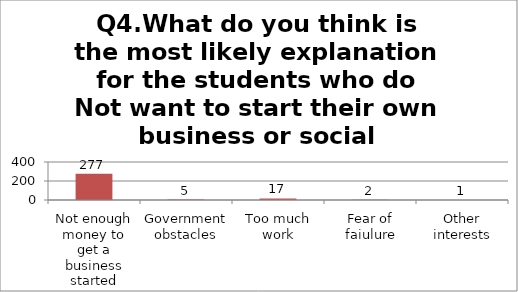
| Category | Q4.What do you think is the most likely explanation for the students who do Not want to start their own business or social enterprise? |
|---|---|
| Not enough money to get a business started | 277 |
| Government obstacles | 5 |
| Too much work | 17 |
| Fear of faiulure | 2 |
| Other interests | 1 |